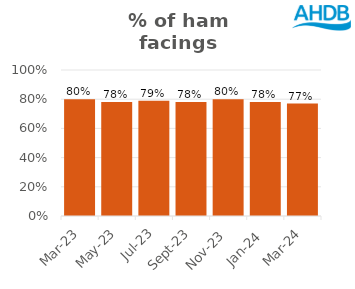
| Category | Ham |
|---|---|
| 2023-03-01 | 0.8 |
| 2023-05-01 | 0.78 |
| 2023-07-01 | 0.79 |
| 2023-09-01 | 0.78 |
| 2023-11-01 | 0.8 |
| 2024-01-01 | 0.78 |
| 2024-03-01 | 0.77 |